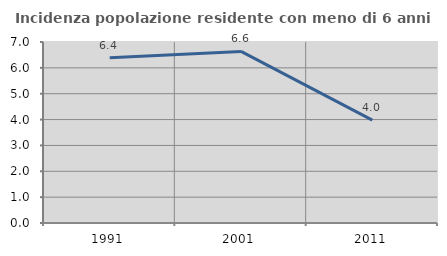
| Category | Incidenza popolazione residente con meno di 6 anni |
|---|---|
| 1991.0 | 6.392 |
| 2001.0 | 6.635 |
| 2011.0 | 3.979 |